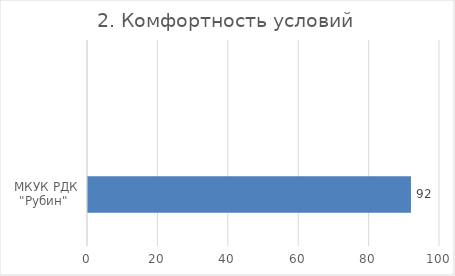
| Category | 2. Комфортность условий |
|---|---|
| МКУК РДК "Рубин"  | 91.756 |